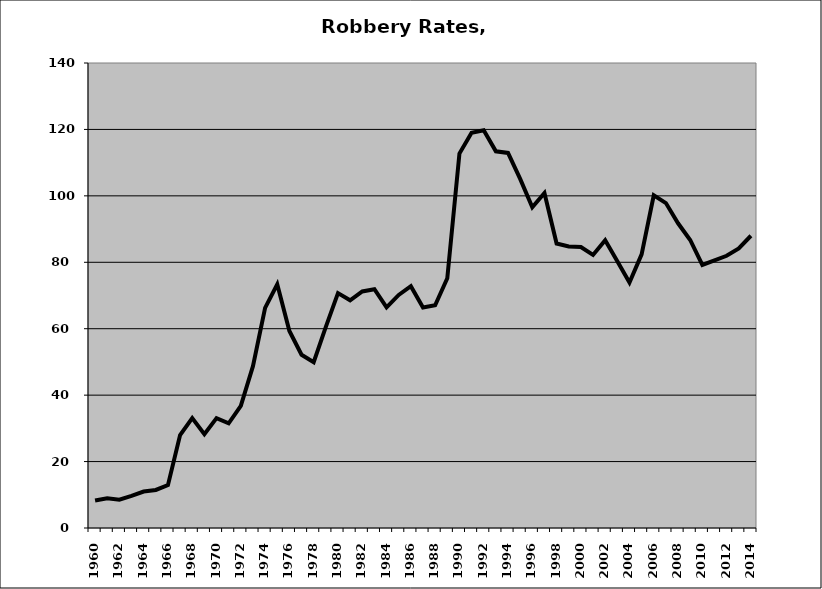
| Category | Robbery |
|---|---|
| 1960.0 | 8.275 |
| 1961.0 | 8.976 |
| 1962.0 | 8.504 |
| 1963.0 | 9.677 |
| 1964.0 | 10.981 |
| 1965.0 | 11.462 |
| 1966.0 | 12.906 |
| 1967.0 | 27.954 |
| 1968.0 | 33.088 |
| 1969.0 | 28.254 |
| 1970.0 | 33.092 |
| 1971.0 | 31.524 |
| 1972.0 | 36.748 |
| 1973.0 | 48.72 |
| 1974.0 | 66.251 |
| 1975.0 | 73.388 |
| 1976.0 | 59.319 |
| 1977.0 | 52.161 |
| 1978.0 | 49.925 |
| 1979.0 | 60.53 |
| 1980.0 | 70.713 |
| 1981.0 | 68.559 |
| 1982.0 | 71.207 |
| 1983.0 | 71.88 |
| 1984.0 | 66.45 |
| 1985.0 | 70.178 |
| 1986.0 | 72.79 |
| 1987.0 | 66.403 |
| 1988.0 | 67.065 |
| 1989.0 | 75.18 |
| 1990.0 | 112.72 |
| 1991.0 | 118.971 |
| 1992.0 | 119.772 |
| 1993.0 | 113.418 |
| 1994.0 | 112.928 |
| 1995.0 | 105.095 |
| 1996.0 | 96.55 |
| 1997.0 | 100.851 |
| 1998.0 | 85.643 |
| 1999.0 | 84.736 |
| 2000.0 | 84.588 |
| 2001.0 | 82.206 |
| 2002.0 | 86.641 |
| 2003.0 | 80.321 |
| 2004.0 | 73.898 |
| 2005.0 | 82.404 |
| 2006.0 | 100.153 |
| 2007.0 | 97.828 |
| 2008.0 | 91.744 |
| 2009.0 | 86.723 |
| 2010.0 | 79.198 |
| 2011.0 | 80.563 |
| 2012.0 | 81.963 |
| 2013.0 | 84.173 |
| 2014.0 | 87.989 |